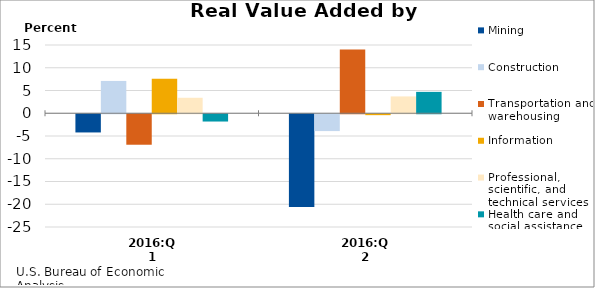
| Category | Mining | Construction | Transportation and warehousing | Information | Professional, scientific, and technical services | Health care and social assistance |
|---|---|---|---|---|---|---|
| 2016:Q1 | -4 | 7.1 | -6.7 | 7.6 | 3.4 | -1.6 |
| 2016:Q2 | -20.4 | -3.7 | 14 | -0.2 | 3.7 | 4.7 |